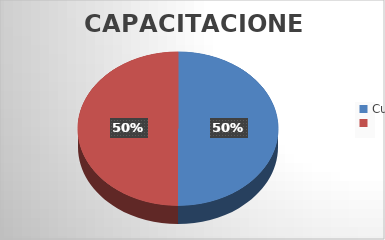
| Category | Series 1 | Series 2 | Series 3 | Series 4 | Series 0 |
|---|---|---|---|---|---|
| Cursos-Talleres: | 1 |  | 0 | 0 |  |